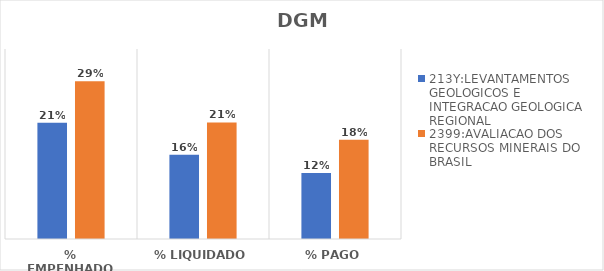
| Category | 213Y:LEVANTAMENTOS GEOLOGICOS E INTEGRACAO GEOLOGICA REGIONAL | 2399:AVALIACAO DOS RECURSOS MINERAIS DO BRASIL |
|---|---|---|
| % EMPENHADO | 0.214 | 0.291 |
| % LIQUIDADO | 0.155 | 0.215 |
| % PAGO | 0.122 | 0.183 |